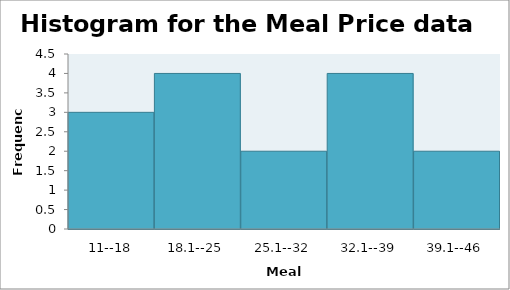
| Category | Series 0 |
|---|---|
| 11--18 | 3 |
| 18.1--25 | 4 |
| 25.1--32 | 2 |
| 32.1--39 | 4 |
| 39.1--46 | 2 |